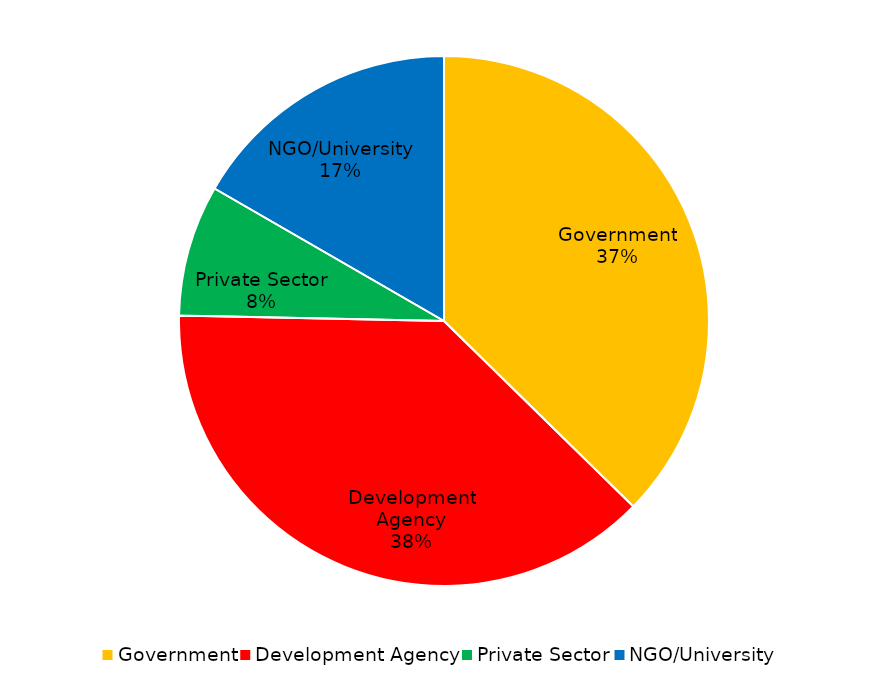
| Category | Series 0 |
|---|---|
| Project | 0.167 |
| Policy | 0.247 |
| Infrastructure | 0.152 |
| Program | 0.129 |
| Fleet | 0.141 |
| Organization | 0.118 |
| Supply Chain | 0.046 |